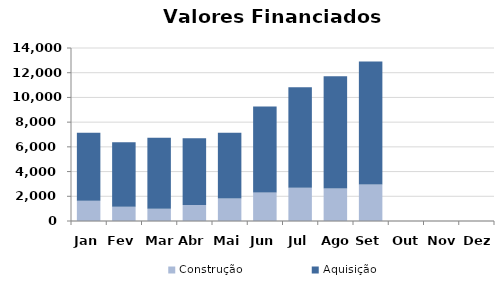
| Category | Construção | Aquisição  |
|---|---|---|
| Jan | 1647.218 | 5494.876 |
| Fev | 1152.824 | 5222.822 |
| Mar | 988.527 | 5741.891 |
| Abr | 1298.638 | 5402.188 |
| Mai | 1814.008 | 5319.9 |
| Jun | 2314.503 | 6953.565 |
| Jul | 2686.171 | 8133.926 |
| Ago | 2622.976 | 9096.504 |
| Set | 2949.608 | 9963.791 |
| Out | 0 | 0 |
| Nov | 0 | 0 |
| Dez | 0 | 0 |